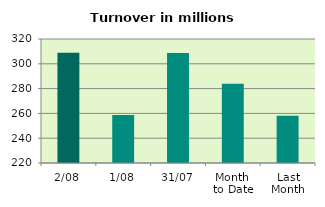
| Category | Series 0 |
|---|---|
| 2/08 | 308.977 |
| 1/08 | 258.743 |
| 31/07 | 308.8 |
| Month 
to Date | 283.86 |
| Last
Month | 258.125 |